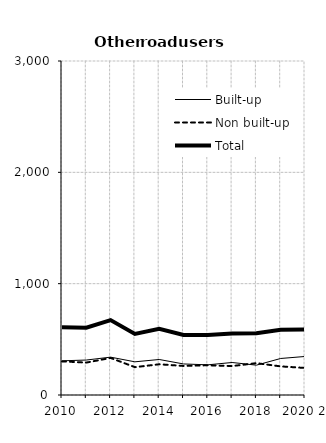
| Category | Built-up | Non built-up | Total |
|---|---|---|---|
| 2010 | 307 | 302 | 609 |
| 2011 | 314 | 291 | 605 |
| 2012 | 340 | 333 | 673 |
| 2013 | 298 | 250 | 548 |
| 2014 | 319 | 276 | 595 |
| 2015 | 279 | 261 | 540 |
| 2016 | 271 | 267 | 538 |
| 2017 | 292 | 260 | 552 |
| 2018 | 268 | 286 | 554 |
| 2019 2 | 328 | 257 | 585 |
| 2020 2 | 346 | 243 | 589 |